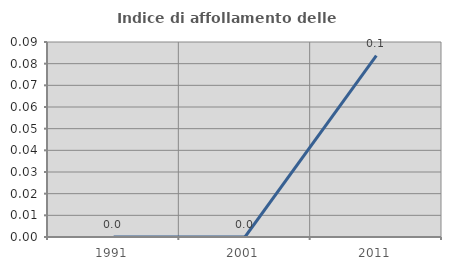
| Category | Indice di affollamento delle abitazioni  |
|---|---|
| 1991.0 | 0 |
| 2001.0 | 0 |
| 2011.0 | 0.084 |